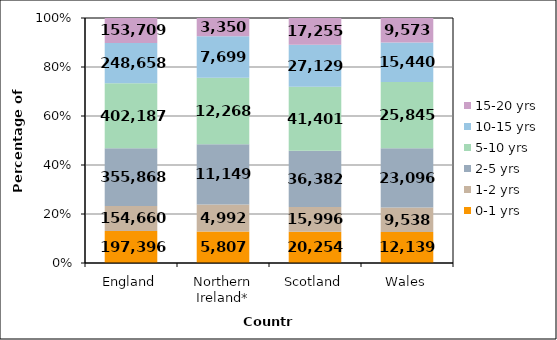
| Category | 0-1 yrs | 1-2 yrs | 2-5 yrs | 5-10 yrs | 10-15 yrs | 15-20 yrs |
|---|---|---|---|---|---|---|
| England | 197396 | 154660 | 355868 | 402187 | 248658 | 153709 |
| Northern Ireland* | 5807 | 4992 | 11149 | 12268 | 7699 | 3350 |
| Scotland | 20254 | 15996 | 36382 | 41401 | 27129 | 17255 |
| Wales | 12139 | 9538 | 23096 | 25845 | 15440 | 9573 |